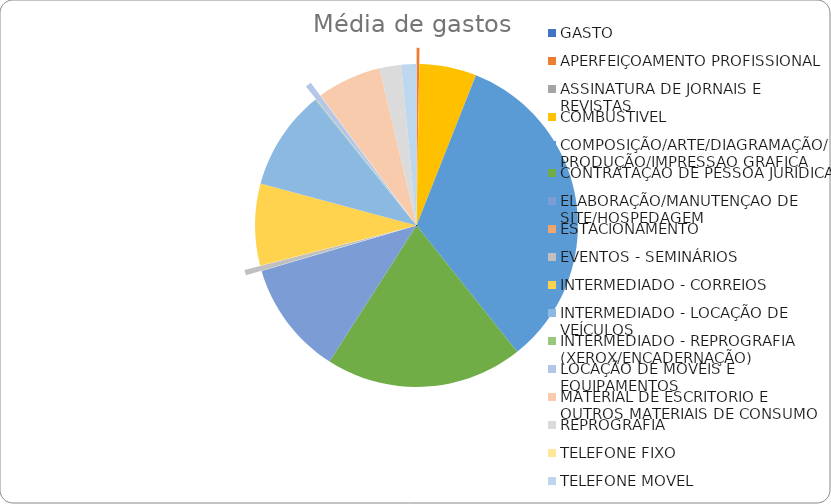
| Category | Series 0 |
|---|---|
| GASTO | 0 |
| APERFEIÇOAMENTO PROFISSIONAL | 727.333 |
| ASSINATURA DE JORNAIS E REVISTAS | 0 |
| COMBUSTIVEL | 14698.283 |
| COMPOSIÇÃO/ARTE/DIAGRAMAÇÃO/PRODUÇÃO/IMPRESSAO GRAFICA | 85593.333 |
| CONTRATAÇAO DE PESSOA JURIDICA | 50809 |
| ELABORAÇÃO/MANUTENÇAO DE SITE/HOSPEDAGEM | 29297.333 |
| ESTACIONAMENTO | 0 |
| EVENTOS - SEMINÁRIOS | 1402.75 |
| INTERMEDIADO - CORREIOS | 21034.807 |
| INTERMEDIADO - LOCAÇÃO DE VEÍCULOS | 25833.77 |
| INTERMEDIADO - REPROGRAFIA (XEROX/ENCADERNAÇÃO) | 146.667 |
| LOCAÇÃO DE MOVEIS E EQUIPAMENTOS | 1533.333 |
| MATERIAL DE ESCRITORIO E OUTROS MATERIAIS DE CONSUMO | 16582.5 |
| REPROGRAFIA | 5561.333 |
| TELEFONE FIXO | 0 |
| TELEFONE MOVEL | 3881.537 |